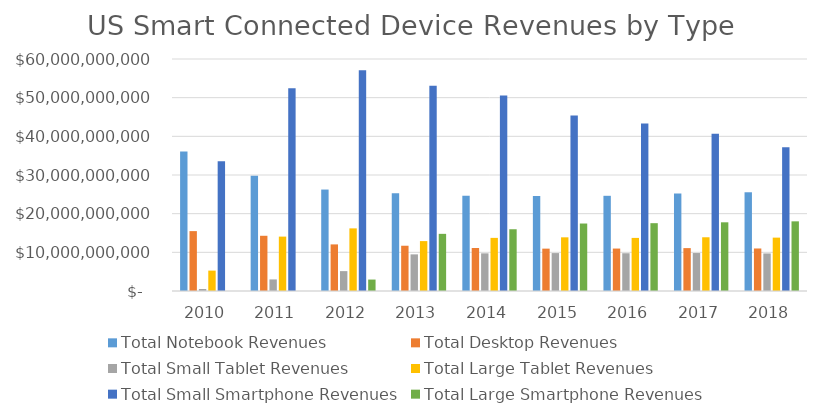
| Category | Total Notebook Revenues | Total Desktop Revenues | Total Small Tablet Revenues | Total Large Tablet Revenues | Total Small Smartphone Revenues | Total Large Smartphone Revenues |
|---|---|---|---|---|---|---|
| 2010.0 | 36065397211.55 | 15487880086.02 | 515502556.53 | 5274911145.23 | 33571912653.9 | 381100.37 |
| 2011.0 | 29794659612.94 | 14280798924.48 | 2993120378.09 | 14067366772.65 | 52407845407.63 | 95066.17 |
| 2012.0 | 26237825890.02 | 12052306030.27 | 5141672042.87 | 16196379819.65 | 57104750447.35 | 2957456878.67 |
| 2013.0 | 25289079476.4 | 11706520102.28 | 9473791459.47 | 12905095464.29 | 53056032278.69 | 14780558039.79 |
| 2014.0 | 24635784730.17 | 11120877039.66 | 9742392756.51 | 13740314741.13 | 50545870185.09 | 15971770271.68 |
| 2015.0 | 24586598502.64 | 10955155722.03 | 9803977645.12 | 13880655231.96 | 45368525071.54 | 17451837388.75 |
| 2016.0 | 24620469650.75 | 10977099342.21 | 9764805064.93 | 13731837620.01 | 43299625805.23 | 17539862343.28 |
| 2017.0 | 25215953052.6 | 11093184595.66 | 9819747738.27 | 13894693819.7 | 40682013465.23 | 17766356683.05 |
| 2018.0 | 25535427717.68 | 10995927001.74 | 9708755950.17 | 13804152822.49 | 37188568400.05 | 18015194634.92 |